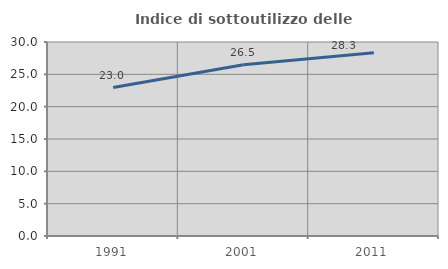
| Category | Indice di sottoutilizzo delle abitazioni  |
|---|---|
| 1991.0 | 22.956 |
| 2001.0 | 26.493 |
| 2011.0 | 28.342 |